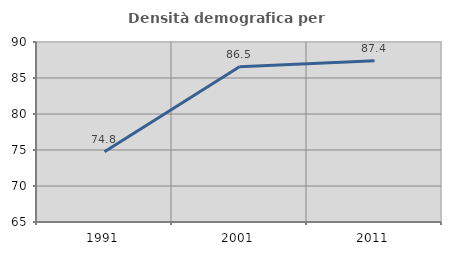
| Category | Densità demografica |
|---|---|
| 1991.0 | 74.752 |
| 2001.0 | 86.55 |
| 2011.0 | 87.411 |